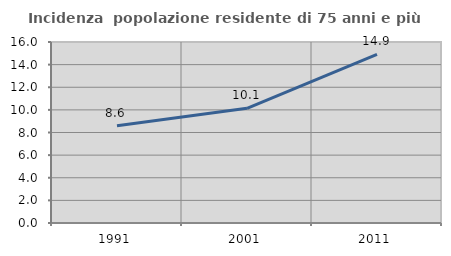
| Category | Incidenza  popolazione residente di 75 anni e più |
|---|---|
| 1991.0 | 8.591 |
| 2001.0 | 10.136 |
| 2011.0 | 14.903 |